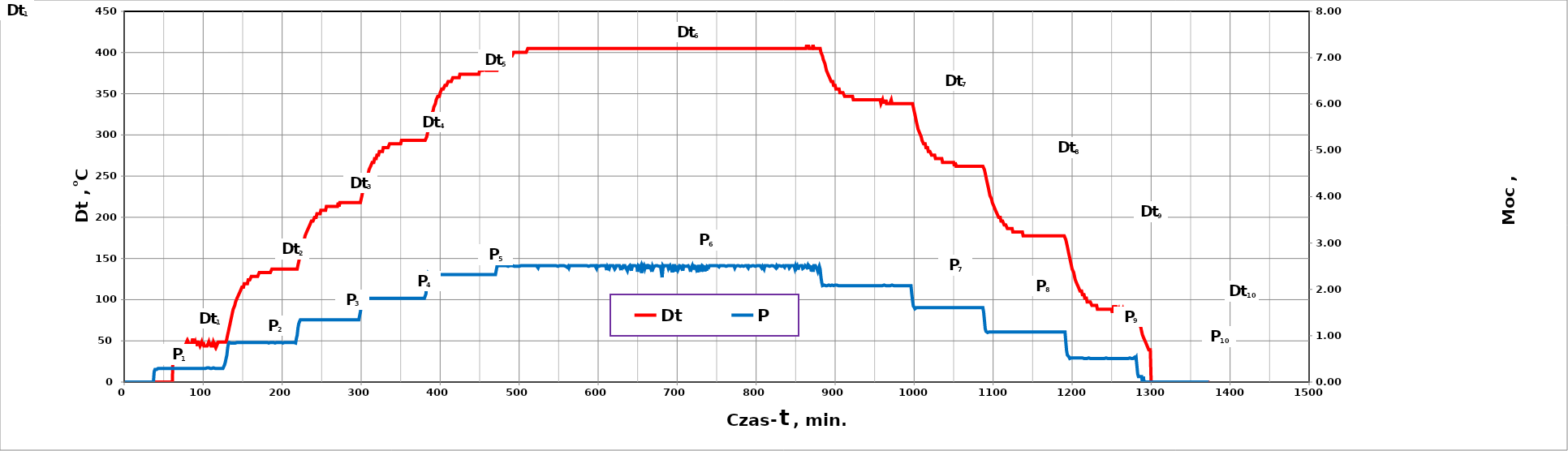
| Category | Dt |
|---|---|
| 1.0 | 0 |
| 2.0 | 0 |
| 3.0 | 0 |
| 4.0 | 0 |
| 5.0 | 0 |
| 6.0 | 0 |
| 7.0 | 0 |
| 8.0 | 0 |
| 9.0 | 0 |
| 10.0 | 0 |
| 11.0 | 0 |
| 12.0 | 0 |
| 13.0 | 0 |
| 14.0 | 0 |
| 15.0 | 0 |
| 16.0 | 0 |
| 17.0 | 0 |
| 18.0 | 0 |
| 19.0 | 0 |
| 20.0 | 0 |
| 21.0 | 0 |
| 22.0 | 0 |
| 23.0 | 0 |
| 24.0 | 0 |
| 25.0 | 0 |
| 26.0 | 0 |
| 27.0 | 0 |
| 28.0 | 0 |
| 29.0 | 0 |
| 30.0 | 0 |
| 31.0 | 0 |
| 32.0 | 0 |
| 33.0 | 0 |
| 34.0 | 0 |
| 35.0 | 0 |
| 36.0 | 0 |
| 37.0 | 0 |
| 38.0 | 0 |
| 39.0 | 0 |
| 40.0 | 0 |
| 41.0 | 0 |
| 42.0 | 0 |
| 43.0 | 0 |
| 44.0 | 0 |
| 45.0 | 0 |
| 46.0 | 0 |
| 47.0 | 0 |
| 48.0 | 0 |
| 49.0 | 0 |
| 50.0 | 0 |
| 51.0 | 0 |
| 52.0 | 0 |
| 53.0 | 0 |
| 54.0 | 0 |
| 55.0 | 0 |
| 56.0 | 0 |
| 57.0 | 0 |
| 58.0 | 0 |
| 59.0 | 0 |
| 60.0 | 0 |
| 61.0 | 0 |
| 62.0 | 39.147 |
| 63.0 | 39.147 |
| 64.0 | 39.147 |
| 65.0 | 39.147 |
| 66.0 | 39.147 |
| 67.0 | 39.147 |
| 68.0 | 39.147 |
| 69.0 | 39.147 |
| 70.0 | 39.147 |
| 71.0 | 39.147 |
| 72.0 | 39.147 |
| 73.0 | 43.798 |
| 74.0 | 43.798 |
| 75.0 | 43.798 |
| 76.0 | 43.798 |
| 77.0 | 43.798 |
| 78.0 | 43.798 |
| 79.0 | 48.45 |
| 80.0 | 43.798 |
| 81.0 | 48.45 |
| 82.0 | 48.45 |
| 83.0 | 43.798 |
| 84.0 | 48.45 |
| 85.0 | 43.798 |
| 86.0 | 43.798 |
| 87.0 | 52.713 |
| 88.0 | 43.798 |
| 89.0 | 43.798 |
| 90.0 | 48.45 |
| 91.0 | 43.798 |
| 92.0 | 48.45 |
| 93.0 | 48.45 |
| 94.0 | 48.45 |
| 95.0 | 48.45 |
| 96.0 | 43.798 |
| 97.0 | 43.798 |
| 98.0 | 48.45 |
| 99.0 | 43.798 |
| 100.0 | 48.45 |
| 101.0 | 43.798 |
| 102.0 | 43.798 |
| 103.0 | 43.798 |
| 104.0 | 43.798 |
| 105.0 | 43.798 |
| 106.0 | 43.798 |
| 107.0 | 48.45 |
| 108.0 | 43.798 |
| 109.0 | 48.45 |
| 110.0 | 43.798 |
| 111.0 | 43.798 |
| 112.0 | 43.798 |
| 113.0 | 48.45 |
| 114.0 | 48.45 |
| 115.0 | 43.798 |
| 116.0 | 48.45 |
| 117.0 | 43.798 |
| 118.0 | 43.798 |
| 119.0 | 48.45 |
| 120.0 | 48.45 |
| 121.0 | 48.45 |
| 122.0 | 48.45 |
| 123.0 | 48.45 |
| 124.0 | 48.45 |
| 125.0 | 48.45 |
| 126.0 | 48.45 |
| 127.0 | 48.45 |
| 128.0 | 48.45 |
| 129.0 | 48.45 |
| 130.0 | 52.713 |
| 131.0 | 57.364 |
| 132.0 | 61.628 |
| 133.0 | 66.279 |
| 134.0 | 70.543 |
| 135.0 | 75.194 |
| 136.0 | 79.457 |
| 137.0 | 84.109 |
| 138.0 | 88.372 |
| 139.0 | 88.372 |
| 140.0 | 93.023 |
| 141.0 | 97.287 |
| 142.0 | 97.287 |
| 143.0 | 101.938 |
| 144.0 | 101.938 |
| 145.0 | 106.202 |
| 146.0 | 106.202 |
| 147.0 | 110.465 |
| 148.0 | 110.465 |
| 149.0 | 115.116 |
| 150.0 | 115.116 |
| 151.0 | 115.116 |
| 152.0 | 119.38 |
| 153.0 | 119.38 |
| 154.0 | 119.38 |
| 155.0 | 119.38 |
| 156.0 | 119.38 |
| 157.0 | 124.031 |
| 158.0 | 124.031 |
| 159.0 | 124.031 |
| 160.0 | 124.031 |
| 161.0 | 128.295 |
| 162.0 | 128.295 |
| 163.0 | 128.295 |
| 164.0 | 128.295 |
| 165.0 | 128.295 |
| 166.0 | 128.295 |
| 167.0 | 128.295 |
| 168.0 | 128.295 |
| 169.0 | 128.295 |
| 170.0 | 128.295 |
| 171.0 | 132.946 |
| 172.0 | 132.946 |
| 173.0 | 132.946 |
| 174.0 | 132.946 |
| 175.0 | 132.946 |
| 176.0 | 132.946 |
| 177.0 | 132.946 |
| 178.0 | 132.946 |
| 179.0 | 132.946 |
| 180.0 | 132.946 |
| 181.0 | 132.946 |
| 182.0 | 132.946 |
| 183.0 | 132.946 |
| 184.0 | 132.946 |
| 185.0 | 132.946 |
| 186.0 | 132.946 |
| 187.0 | 137.209 |
| 188.0 | 137.209 |
| 189.0 | 137.209 |
| 190.0 | 137.209 |
| 191.0 | 137.209 |
| 192.0 | 137.209 |
| 193.0 | 137.209 |
| 194.0 | 137.209 |
| 195.0 | 137.209 |
| 196.0 | 137.209 |
| 197.0 | 137.209 |
| 198.0 | 137.209 |
| 199.0 | 137.209 |
| 200.0 | 137.209 |
| 201.0 | 137.209 |
| 202.0 | 137.209 |
| 203.0 | 137.209 |
| 204.0 | 137.209 |
| 205.0 | 137.209 |
| 206.0 | 137.209 |
| 207.0 | 137.209 |
| 208.0 | 137.209 |
| 209.0 | 137.209 |
| 210.0 | 137.209 |
| 211.0 | 137.209 |
| 212.0 | 137.209 |
| 213.0 | 137.209 |
| 214.0 | 137.209 |
| 215.0 | 137.209 |
| 216.0 | 137.209 |
| 217.0 | 137.209 |
| 218.0 | 137.209 |
| 219.0 | 137.209 |
| 220.0 | 141.86 |
| 221.0 | 146.124 |
| 222.0 | 150.775 |
| 223.0 | 155.039 |
| 224.0 | 159.69 |
| 225.0 | 164.341 |
| 226.0 | 168.605 |
| 227.0 | 168.605 |
| 228.0 | 172.868 |
| 229.0 | 177.519 |
| 230.0 | 177.519 |
| 231.0 | 182.171 |
| 232.0 | 182.171 |
| 233.0 | 186.434 |
| 234.0 | 186.434 |
| 235.0 | 190.698 |
| 236.0 | 190.698 |
| 237.0 | 195.349 |
| 238.0 | 195.349 |
| 239.0 | 195.349 |
| 240.0 | 195.349 |
| 241.0 | 200 |
| 242.0 | 200 |
| 243.0 | 200 |
| 244.0 | 204.264 |
| 245.0 | 204.264 |
| 246.0 | 204.264 |
| 247.0 | 204.264 |
| 248.0 | 204.264 |
| 249.0 | 208.527 |
| 250.0 | 208.527 |
| 251.0 | 208.527 |
| 252.0 | 208.527 |
| 253.0 | 208.527 |
| 254.0 | 208.527 |
| 255.0 | 208.527 |
| 256.0 | 213.178 |
| 257.0 | 213.178 |
| 258.0 | 213.178 |
| 259.0 | 213.178 |
| 260.0 | 213.178 |
| 261.0 | 213.178 |
| 262.0 | 213.178 |
| 263.0 | 213.178 |
| 264.0 | 213.178 |
| 265.0 | 213.178 |
| 266.0 | 213.178 |
| 267.0 | 213.178 |
| 268.0 | 213.178 |
| 269.0 | 213.178 |
| 270.0 | 213.178 |
| 271.0 | 217.829 |
| 272.0 | 213.178 |
| 273.0 | 217.829 |
| 274.0 | 217.829 |
| 275.0 | 217.829 |
| 276.0 | 217.829 |
| 277.0 | 217.829 |
| 278.0 | 217.829 |
| 279.0 | 217.829 |
| 280.0 | 217.829 |
| 281.0 | 217.829 |
| 282.0 | 217.829 |
| 283.0 | 217.829 |
| 284.0 | 217.829 |
| 285.0 | 217.829 |
| 286.0 | 217.829 |
| 287.0 | 217.829 |
| 288.0 | 217.829 |
| 289.0 | 217.829 |
| 290.0 | 217.829 |
| 291.0 | 217.829 |
| 292.0 | 217.829 |
| 293.0 | 217.829 |
| 294.0 | 217.829 |
| 295.0 | 217.829 |
| 296.0 | 217.829 |
| 297.0 | 217.829 |
| 298.0 | 217.829 |
| 299.0 | 217.829 |
| 300.0 | 222.093 |
| 301.0 | 226.357 |
| 302.0 | 231.008 |
| 303.0 | 235.659 |
| 304.0 | 235.659 |
| 305.0 | 239.922 |
| 306.0 | 244.186 |
| 307.0 | 248.837 |
| 308.0 | 248.837 |
| 309.0 | 253.488 |
| 310.0 | 257.752 |
| 311.0 | 257.752 |
| 312.0 | 262.016 |
| 313.0 | 262.016 |
| 314.0 | 266.667 |
| 315.0 | 266.667 |
| 316.0 | 266.667 |
| 317.0 | 271.318 |
| 318.0 | 271.318 |
| 319.0 | 271.318 |
| 320.0 | 275.581 |
| 321.0 | 275.581 |
| 322.0 | 275.581 |
| 323.0 | 279.845 |
| 324.0 | 279.845 |
| 325.0 | 279.845 |
| 326.0 | 279.845 |
| 327.0 | 279.845 |
| 328.0 | 284.496 |
| 329.0 | 284.496 |
| 330.0 | 284.496 |
| 331.0 | 284.496 |
| 332.0 | 284.496 |
| 333.0 | 284.496 |
| 334.0 | 284.496 |
| 335.0 | 284.496 |
| 336.0 | 289.147 |
| 337.0 | 289.147 |
| 338.0 | 289.147 |
| 339.0 | 289.147 |
| 340.0 | 289.147 |
| 341.0 | 289.147 |
| 342.0 | 289.147 |
| 343.0 | 289.147 |
| 344.0 | 289.147 |
| 345.0 | 289.147 |
| 346.0 | 289.147 |
| 347.0 | 289.147 |
| 348.0 | 289.147 |
| 349.0 | 289.147 |
| 350.0 | 289.147 |
| 351.0 | 293.411 |
| 352.0 | 293.411 |
| 353.0 | 293.411 |
| 354.0 | 293.411 |
| 355.0 | 293.411 |
| 356.0 | 293.411 |
| 357.0 | 293.411 |
| 358.0 | 293.411 |
| 359.0 | 293.411 |
| 360.0 | 293.411 |
| 361.0 | 293.411 |
| 362.0 | 293.411 |
| 363.0 | 293.411 |
| 364.0 | 293.411 |
| 365.0 | 293.411 |
| 366.0 | 293.411 |
| 367.0 | 293.411 |
| 368.0 | 293.411 |
| 369.0 | 293.411 |
| 370.0 | 293.411 |
| 371.0 | 293.411 |
| 372.0 | 293.411 |
| 373.0 | 293.411 |
| 374.0 | 293.411 |
| 375.0 | 293.411 |
| 376.0 | 293.411 |
| 377.0 | 293.411 |
| 378.0 | 293.411 |
| 379.0 | 293.411 |
| 380.0 | 293.411 |
| 381.0 | 293.411 |
| 382.0 | 293.411 |
| 383.0 | 297.674 |
| 384.0 | 302.326 |
| 385.0 | 306.977 |
| 386.0 | 311.24 |
| 387.0 | 315.504 |
| 388.0 | 320.155 |
| 389.0 | 324.806 |
| 390.0 | 324.806 |
| 391.0 | 329.07 |
| 392.0 | 333.721 |
| 393.0 | 333.721 |
| 394.0 | 337.984 |
| 395.0 | 342.636 |
| 396.0 | 342.636 |
| 397.0 | 346.899 |
| 398.0 | 346.899 |
| 399.0 | 346.899 |
| 400.0 | 351.163 |
| 401.0 | 351.163 |
| 402.0 | 355.814 |
| 403.0 | 355.814 |
| 404.0 | 355.814 |
| 405.0 | 355.814 |
| 406.0 | 360.078 |
| 407.0 | 360.078 |
| 408.0 | 360.078 |
| 409.0 | 360.078 |
| 410.0 | 364.729 |
| 411.0 | 364.729 |
| 412.0 | 364.729 |
| 413.0 | 364.729 |
| 414.0 | 364.729 |
| 415.0 | 364.729 |
| 416.0 | 369.38 |
| 417.0 | 369.38 |
| 418.0 | 369.38 |
| 419.0 | 369.38 |
| 420.0 | 369.38 |
| 421.0 | 369.38 |
| 422.0 | 369.38 |
| 423.0 | 369.38 |
| 424.0 | 369.38 |
| 425.0 | 373.643 |
| 426.0 | 373.643 |
| 427.0 | 373.643 |
| 428.0 | 373.643 |
| 429.0 | 373.643 |
| 430.0 | 373.643 |
| 431.0 | 373.643 |
| 432.0 | 373.643 |
| 433.0 | 373.643 |
| 434.0 | 373.643 |
| 435.0 | 373.643 |
| 436.0 | 373.643 |
| 437.0 | 373.643 |
| 438.0 | 373.643 |
| 439.0 | 373.643 |
| 440.0 | 373.643 |
| 441.0 | 373.643 |
| 442.0 | 373.643 |
| 443.0 | 373.643 |
| 444.0 | 373.643 |
| 445.0 | 373.643 |
| 446.0 | 373.643 |
| 447.0 | 373.643 |
| 448.0 | 373.643 |
| 449.0 | 373.643 |
| 450.0 | 378.295 |
| 451.0 | 378.295 |
| 452.0 | 378.295 |
| 453.0 | 378.295 |
| 454.0 | 378.295 |
| 455.0 | 378.295 |
| 456.0 | 382.558 |
| 457.0 | 382.558 |
| 458.0 | 378.295 |
| 459.0 | 378.295 |
| 460.0 | 378.295 |
| 461.0 | 378.295 |
| 462.0 | 378.295 |
| 463.0 | 378.295 |
| 464.0 | 378.295 |
| 465.0 | 378.295 |
| 466.0 | 378.295 |
| 467.0 | 378.295 |
| 468.0 | 378.295 |
| 469.0 | 378.295 |
| 470.0 | 378.295 |
| 471.0 | 378.295 |
| 472.0 | 378.295 |
| 473.0 | 382.558 |
| 474.0 | 382.558 |
| 475.0 | 382.558 |
| 476.0 | 386.822 |
| 477.0 | 386.822 |
| 478.0 | 386.822 |
| 479.0 | 386.822 |
| 480.0 | 391.473 |
| 481.0 | 391.473 |
| 482.0 | 391.473 |
| 483.0 | 391.473 |
| 484.0 | 391.473 |
| 485.0 | 395.736 |
| 486.0 | 395.736 |
| 487.0 | 395.736 |
| 488.0 | 395.736 |
| 489.0 | 395.736 |
| 490.0 | 395.736 |
| 491.0 | 395.736 |
| 492.0 | 395.736 |
| 493.0 | 400.388 |
| 494.0 | 400.388 |
| 495.0 | 400.388 |
| 496.0 | 400.388 |
| 497.0 | 400.388 |
| 498.0 | 400.388 |
| 499.0 | 400.388 |
| 500.0 | 400.388 |
| 501.0 | 400.388 |
| 502.0 | 400.388 |
| 503.0 | 400.388 |
| 504.0 | 400.388 |
| 505.0 | 400.388 |
| 506.0 | 400.388 |
| 507.0 | 400.388 |
| 508.0 | 400.388 |
| 509.0 | 400.388 |
| 510.0 | 400.388 |
| 511.0 | 405.039 |
| 512.0 | 405.039 |
| 513.0 | 405.039 |
| 514.0 | 405.039 |
| 515.0 | 405.039 |
| 516.0 | 405.039 |
| 517.0 | 405.039 |
| 518.0 | 405.039 |
| 519.0 | 405.039 |
| 520.0 | 405.039 |
| 521.0 | 405.039 |
| 522.0 | 405.039 |
| 523.0 | 405.039 |
| 524.0 | 405.039 |
| 525.0 | 405.039 |
| 526.0 | 405.039 |
| 527.0 | 405.039 |
| 528.0 | 405.039 |
| 529.0 | 405.039 |
| 530.0 | 405.039 |
| 531.0 | 405.039 |
| 532.0 | 405.039 |
| 533.0 | 405.039 |
| 534.0 | 405.039 |
| 535.0 | 405.039 |
| 536.0 | 405.039 |
| 537.0 | 405.039 |
| 538.0 | 405.039 |
| 539.0 | 405.039 |
| 540.0 | 405.039 |
| 541.0 | 405.039 |
| 542.0 | 405.039 |
| 543.0 | 405.039 |
| 544.0 | 405.039 |
| 545.0 | 405.039 |
| 546.0 | 405.039 |
| 547.0 | 405.039 |
| 548.0 | 405.039 |
| 549.0 | 405.039 |
| 550.0 | 405.039 |
| 551.0 | 405.039 |
| 552.0 | 405.039 |
| 553.0 | 405.039 |
| 554.0 | 405.039 |
| 555.0 | 405.039 |
| 556.0 | 405.039 |
| 557.0 | 405.039 |
| 558.0 | 405.039 |
| 559.0 | 405.039 |
| 560.0 | 405.039 |
| 561.0 | 405.039 |
| 562.0 | 405.039 |
| 563.0 | 405.039 |
| 564.0 | 405.039 |
| 565.0 | 405.039 |
| 566.0 | 405.039 |
| 567.0 | 405.039 |
| 568.0 | 405.039 |
| 569.0 | 405.039 |
| 570.0 | 405.039 |
| 571.0 | 405.039 |
| 572.0 | 405.039 |
| 573.0 | 405.039 |
| 574.0 | 405.039 |
| 575.0 | 405.039 |
| 576.0 | 405.039 |
| 577.0 | 405.039 |
| 578.0 | 405.039 |
| 579.0 | 405.039 |
| 580.0 | 405.039 |
| 581.0 | 405.039 |
| 582.0 | 405.039 |
| 583.0 | 405.039 |
| 584.0 | 405.039 |
| 585.0 | 405.039 |
| 586.0 | 405.039 |
| 587.0 | 405.039 |
| 588.0 | 405.039 |
| 589.0 | 405.039 |
| 590.0 | 405.039 |
| 591.0 | 405.039 |
| 592.0 | 405.039 |
| 593.0 | 405.039 |
| 594.0 | 405.039 |
| 595.0 | 405.039 |
| 596.0 | 405.039 |
| 597.0 | 405.039 |
| 598.0 | 405.039 |
| 599.0 | 405.039 |
| 600.0 | 405.039 |
| 601.0 | 405.039 |
| 602.0 | 405.039 |
| 603.0 | 405.039 |
| 604.0 | 405.039 |
| 605.0 | 405.039 |
| 606.0 | 405.039 |
| 607.0 | 405.039 |
| 608.0 | 405.039 |
| 609.0 | 405.039 |
| 610.0 | 405.039 |
| 611.0 | 405.039 |
| 612.0 | 405.039 |
| 613.0 | 405.039 |
| 614.0 | 405.039 |
| 615.0 | 405.039 |
| 616.0 | 405.039 |
| 617.0 | 405.039 |
| 618.0 | 405.039 |
| 619.0 | 405.039 |
| 620.0 | 405.039 |
| 621.0 | 405.039 |
| 622.0 | 405.039 |
| 623.0 | 405.039 |
| 624.0 | 405.039 |
| 625.0 | 405.039 |
| 626.0 | 405.039 |
| 627.0 | 405.039 |
| 628.0 | 405.039 |
| 629.0 | 405.039 |
| 630.0 | 405.039 |
| 631.0 | 405.039 |
| 632.0 | 405.039 |
| 633.0 | 405.039 |
| 634.0 | 405.039 |
| 635.0 | 405.039 |
| 636.0 | 405.039 |
| 637.0 | 405.039 |
| 638.0 | 405.039 |
| 639.0 | 405.039 |
| 640.0 | 405.039 |
| 641.0 | 405.039 |
| 642.0 | 405.039 |
| 643.0 | 405.039 |
| 644.0 | 405.039 |
| 645.0 | 405.039 |
| 646.0 | 405.039 |
| 647.0 | 405.039 |
| 648.0 | 405.039 |
| 649.0 | 405.039 |
| 650.0 | 405.039 |
| 651.0 | 405.039 |
| 652.0 | 405.039 |
| 653.0 | 405.039 |
| 654.0 | 405.039 |
| 655.0 | 405.039 |
| 656.0 | 405.039 |
| 657.0 | 405.039 |
| 658.0 | 405.039 |
| 659.0 | 405.039 |
| 660.0 | 405.039 |
| 661.0 | 405.039 |
| 662.0 | 405.039 |
| 663.0 | 405.039 |
| 664.0 | 405.039 |
| 665.0 | 405.039 |
| 666.0 | 405.039 |
| 667.0 | 405.039 |
| 668.0 | 405.039 |
| 669.0 | 405.039 |
| 670.0 | 405.039 |
| 671.0 | 405.039 |
| 672.0 | 405.039 |
| 673.0 | 405.039 |
| 674.0 | 405.039 |
| 675.0 | 405.039 |
| 676.0 | 405.039 |
| 677.0 | 405.039 |
| 678.0 | 405.039 |
| 679.0 | 405.039 |
| 680.0 | 405.039 |
| 681.0 | 405.039 |
| 682.0 | 405.039 |
| 683.0 | 405.039 |
| 684.0 | 405.039 |
| 685.0 | 405.039 |
| 686.0 | 405.039 |
| 687.0 | 405.039 |
| 688.0 | 405.039 |
| 689.0 | 405.039 |
| 690.0 | 405.039 |
| 691.0 | 405.039 |
| 692.0 | 405.039 |
| 693.0 | 405.039 |
| 694.0 | 405.039 |
| 695.0 | 405.039 |
| 696.0 | 405.039 |
| 697.0 | 405.039 |
| 698.0 | 405.039 |
| 699.0 | 405.039 |
| 700.0 | 405.039 |
| 701.0 | 405.039 |
| 702.0 | 405.039 |
| 703.0 | 405.039 |
| 704.0 | 405.039 |
| 705.0 | 405.039 |
| 706.0 | 405.039 |
| 707.0 | 405.039 |
| 708.0 | 405.039 |
| 709.0 | 405.039 |
| 710.0 | 405.039 |
| 711.0 | 405.039 |
| 712.0 | 405.039 |
| 713.0 | 405.039 |
| 714.0 | 405.039 |
| 715.0 | 405.039 |
| 716.0 | 405.039 |
| 717.0 | 405.039 |
| 718.0 | 405.039 |
| 719.0 | 405.039 |
| 720.0 | 405.039 |
| 721.0 | 405.039 |
| 722.0 | 405.039 |
| 723.0 | 405.039 |
| 724.0 | 405.039 |
| 725.0 | 405.039 |
| 726.0 | 405.039 |
| 727.0 | 405.039 |
| 728.0 | 405.039 |
| 729.0 | 405.039 |
| 730.0 | 405.039 |
| 731.0 | 405.039 |
| 732.0 | 405.039 |
| 733.0 | 405.039 |
| 734.0 | 405.039 |
| 735.0 | 405.039 |
| 736.0 | 405.039 |
| 737.0 | 405.039 |
| 738.0 | 405.039 |
| 739.0 | 405.039 |
| 740.0 | 405.039 |
| 741.0 | 405.039 |
| 742.0 | 405.039 |
| 743.0 | 405.039 |
| 744.0 | 405.039 |
| 745.0 | 405.039 |
| 746.0 | 405.039 |
| 747.0 | 405.039 |
| 748.0 | 405.039 |
| 749.0 | 405.039 |
| 750.0 | 405.039 |
| 751.0 | 405.039 |
| 752.0 | 405.039 |
| 753.0 | 405.039 |
| 754.0 | 405.039 |
| 755.0 | 405.039 |
| 756.0 | 405.039 |
| 757.0 | 405.039 |
| 758.0 | 405.039 |
| 759.0 | 405.039 |
| 760.0 | 405.039 |
| 761.0 | 405.039 |
| 762.0 | 405.039 |
| 763.0 | 405.039 |
| 764.0 | 405.039 |
| 765.0 | 405.039 |
| 766.0 | 405.039 |
| 767.0 | 405.039 |
| 768.0 | 405.039 |
| 769.0 | 405.039 |
| 770.0 | 405.039 |
| 771.0 | 405.039 |
| 772.0 | 405.039 |
| 773.0 | 405.039 |
| 774.0 | 405.039 |
| 775.0 | 405.039 |
| 776.0 | 405.039 |
| 777.0 | 405.039 |
| 778.0 | 405.039 |
| 779.0 | 405.039 |
| 780.0 | 405.039 |
| 781.0 | 405.039 |
| 782.0 | 405.039 |
| 783.0 | 405.039 |
| 784.0 | 405.039 |
| 785.0 | 405.039 |
| 786.0 | 405.039 |
| 787.0 | 405.039 |
| 788.0 | 405.039 |
| 789.0 | 405.039 |
| 790.0 | 405.039 |
| 791.0 | 405.039 |
| 792.0 | 405.039 |
| 793.0 | 405.039 |
| 794.0 | 405.039 |
| 795.0 | 405.039 |
| 796.0 | 405.039 |
| 797.0 | 405.039 |
| 798.0 | 405.039 |
| 799.0 | 405.039 |
| 800.0 | 405.039 |
| 801.0 | 405.039 |
| 802.0 | 405.039 |
| 803.0 | 405.039 |
| 804.0 | 405.039 |
| 805.0 | 405.039 |
| 806.0 | 405.039 |
| 807.0 | 405.039 |
| 808.0 | 405.039 |
| 809.0 | 405.039 |
| 810.0 | 405.039 |
| 811.0 | 405.039 |
| 812.0 | 405.039 |
| 813.0 | 405.039 |
| 814.0 | 405.039 |
| 815.0 | 405.039 |
| 816.0 | 405.039 |
| 817.0 | 405.039 |
| 818.0 | 405.039 |
| 819.0 | 405.039 |
| 820.0 | 405.039 |
| 821.0 | 405.039 |
| 822.0 | 405.039 |
| 823.0 | 405.039 |
| 824.0 | 405.039 |
| 825.0 | 405.039 |
| 826.0 | 405.039 |
| 827.0 | 405.039 |
| 828.0 | 405.039 |
| 829.0 | 405.039 |
| 830.0 | 405.039 |
| 831.0 | 405.039 |
| 832.0 | 405.039 |
| 833.0 | 405.039 |
| 834.0 | 405.039 |
| 835.0 | 405.039 |
| 836.0 | 405.039 |
| 837.0 | 405.039 |
| 838.0 | 405.039 |
| 839.0 | 405.039 |
| 840.0 | 405.039 |
| 841.0 | 405.039 |
| 842.0 | 405.039 |
| 843.0 | 405.039 |
| 844.0 | 405.039 |
| 845.0 | 405.039 |
| 846.0 | 405.039 |
| 847.0 | 405.039 |
| 848.0 | 405.039 |
| 849.0 | 405.039 |
| 850.0 | 405.039 |
| 851.0 | 405.039 |
| 852.0 | 405.039 |
| 853.0 | 405.039 |
| 854.0 | 405.039 |
| 855.0 | 405.039 |
| 856.0 | 405.039 |
| 857.0 | 405.039 |
| 858.0 | 405.039 |
| 859.0 | 405.039 |
| 860.0 | 405.039 |
| 861.0 | 405.039 |
| 862.0 | 405.039 |
| 863.0 | 405.039 |
| 864.0 | 409.302 |
| 865.0 | 405.039 |
| 866.0 | 409.302 |
| 867.0 | 405.039 |
| 868.0 | 405.039 |
| 869.0 | 405.039 |
| 870.0 | 405.039 |
| 871.0 | 405.039 |
| 872.0 | 409.302 |
| 873.0 | 405.039 |
| 874.0 | 405.039 |
| 875.0 | 405.039 |
| 876.0 | 405.039 |
| 877.0 | 405.039 |
| 878.0 | 405.039 |
| 879.0 | 405.039 |
| 880.0 | 405.039 |
| 881.0 | 405.039 |
| 882.0 | 400.388 |
| 883.0 | 400.388 |
| 884.0 | 395.736 |
| 885.0 | 391.473 |
| 886.0 | 391.473 |
| 887.0 | 386.822 |
| 888.0 | 382.558 |
| 889.0 | 378.295 |
| 890.0 | 378.295 |
| 891.0 | 373.643 |
| 892.0 | 373.643 |
| 893.0 | 369.38 |
| 894.0 | 369.38 |
| 895.0 | 364.729 |
| 896.0 | 364.729 |
| 897.0 | 364.729 |
| 898.0 | 360.078 |
| 899.0 | 360.078 |
| 900.0 | 360.078 |
| 901.0 | 355.814 |
| 902.0 | 355.814 |
| 903.0 | 355.814 |
| 904.0 | 355.814 |
| 905.0 | 355.814 |
| 906.0 | 351.163 |
| 907.0 | 351.163 |
| 908.0 | 351.163 |
| 909.0 | 351.163 |
| 910.0 | 351.163 |
| 911.0 | 351.163 |
| 912.0 | 346.899 |
| 913.0 | 346.899 |
| 914.0 | 346.899 |
| 915.0 | 346.899 |
| 916.0 | 346.899 |
| 917.0 | 346.899 |
| 918.0 | 346.899 |
| 919.0 | 346.899 |
| 920.0 | 346.899 |
| 921.0 | 346.899 |
| 922.0 | 346.899 |
| 923.0 | 342.636 |
| 924.0 | 342.636 |
| 925.0 | 342.636 |
| 926.0 | 342.636 |
| 927.0 | 342.636 |
| 928.0 | 342.636 |
| 929.0 | 342.636 |
| 930.0 | 342.636 |
| 931.0 | 342.636 |
| 932.0 | 342.636 |
| 933.0 | 342.636 |
| 934.0 | 342.636 |
| 935.0 | 342.636 |
| 936.0 | 342.636 |
| 937.0 | 342.636 |
| 938.0 | 342.636 |
| 939.0 | 342.636 |
| 940.0 | 342.636 |
| 941.0 | 342.636 |
| 942.0 | 342.636 |
| 943.0 | 342.636 |
| 944.0 | 342.636 |
| 945.0 | 342.636 |
| 946.0 | 342.636 |
| 947.0 | 342.636 |
| 948.0 | 342.636 |
| 949.0 | 342.636 |
| 950.0 | 342.636 |
| 951.0 | 342.636 |
| 952.0 | 342.636 |
| 953.0 | 342.636 |
| 954.0 | 342.636 |
| 955.0 | 342.636 |
| 956.0 | 342.636 |
| 957.0 | 342.636 |
| 958.0 | 337.984 |
| 959.0 | 337.984 |
| 960.0 | 342.636 |
| 961.0 | 337.984 |
| 962.0 | 342.636 |
| 963.0 | 337.984 |
| 964.0 | 342.636 |
| 965.0 | 337.984 |
| 966.0 | 337.984 |
| 967.0 | 337.984 |
| 968.0 | 337.984 |
| 969.0 | 337.984 |
| 970.0 | 337.984 |
| 971.0 | 342.636 |
| 972.0 | 337.984 |
| 973.0 | 337.984 |
| 974.0 | 337.984 |
| 975.0 | 337.984 |
| 976.0 | 337.984 |
| 977.0 | 337.984 |
| 978.0 | 337.984 |
| 979.0 | 337.984 |
| 980.0 | 337.984 |
| 981.0 | 337.984 |
| 982.0 | 337.984 |
| 983.0 | 337.984 |
| 984.0 | 337.984 |
| 985.0 | 337.984 |
| 986.0 | 337.984 |
| 987.0 | 337.984 |
| 988.0 | 337.984 |
| 989.0 | 337.984 |
| 990.0 | 337.984 |
| 991.0 | 337.984 |
| 992.0 | 337.984 |
| 993.0 | 337.984 |
| 994.0 | 337.984 |
| 995.0 | 337.984 |
| 996.0 | 337.984 |
| 997.0 | 337.984 |
| 998.0 | 337.984 |
| 999.0 | 333.721 |
| 1000.0 | 329.07 |
| 1001.0 | 324.806 |
| 1002.0 | 320.155 |
| 1003.0 | 315.504 |
| 1004.0 | 311.24 |
| 1005.0 | 306.977 |
| 1006.0 | 306.977 |
| 1007.0 | 302.326 |
| 1008.0 | 302.326 |
| 1009.0 | 297.674 |
| 1010.0 | 293.411 |
| 1011.0 | 293.411 |
| 1012.0 | 289.147 |
| 1013.0 | 289.147 |
| 1014.0 | 289.147 |
| 1015.0 | 284.496 |
| 1016.0 | 284.496 |
| 1017.0 | 284.496 |
| 1018.0 | 279.845 |
| 1019.0 | 279.845 |
| 1020.0 | 279.845 |
| 1021.0 | 279.845 |
| 1022.0 | 275.581 |
| 1023.0 | 275.581 |
| 1024.0 | 275.581 |
| 1025.0 | 275.581 |
| 1026.0 | 275.581 |
| 1027.0 | 271.318 |
| 1028.0 | 271.318 |
| 1029.0 | 271.318 |
| 1030.0 | 271.318 |
| 1031.0 | 271.318 |
| 1032.0 | 271.318 |
| 1033.0 | 271.318 |
| 1034.0 | 271.318 |
| 1035.0 | 271.318 |
| 1036.0 | 266.667 |
| 1037.0 | 266.667 |
| 1038.0 | 266.667 |
| 1039.0 | 266.667 |
| 1040.0 | 266.667 |
| 1041.0 | 266.667 |
| 1042.0 | 266.667 |
| 1043.0 | 266.667 |
| 1044.0 | 266.667 |
| 1045.0 | 266.667 |
| 1046.0 | 266.667 |
| 1047.0 | 266.667 |
| 1048.0 | 266.667 |
| 1049.0 | 266.667 |
| 1050.0 | 266.667 |
| 1051.0 | 262.016 |
| 1052.0 | 266.667 |
| 1053.0 | 262.016 |
| 1054.0 | 262.016 |
| 1055.0 | 262.016 |
| 1056.0 | 262.016 |
| 1057.0 | 262.016 |
| 1058.0 | 262.016 |
| 1059.0 | 262.016 |
| 1060.0 | 262.016 |
| 1061.0 | 262.016 |
| 1062.0 | 262.016 |
| 1063.0 | 262.016 |
| 1064.0 | 262.016 |
| 1065.0 | 262.016 |
| 1066.0 | 262.016 |
| 1067.0 | 262.016 |
| 1068.0 | 262.016 |
| 1069.0 | 262.016 |
| 1070.0 | 262.016 |
| 1071.0 | 262.016 |
| 1072.0 | 262.016 |
| 1073.0 | 262.016 |
| 1074.0 | 262.016 |
| 1075.0 | 262.016 |
| 1076.0 | 262.016 |
| 1077.0 | 262.016 |
| 1078.0 | 262.016 |
| 1079.0 | 262.016 |
| 1080.0 | 262.016 |
| 1081.0 | 262.016 |
| 1082.0 | 262.016 |
| 1083.0 | 262.016 |
| 1084.0 | 262.016 |
| 1085.0 | 262.016 |
| 1086.0 | 262.016 |
| 1087.0 | 262.016 |
| 1088.0 | 262.016 |
| 1089.0 | 257.752 |
| 1090.0 | 253.488 |
| 1091.0 | 248.837 |
| 1092.0 | 244.186 |
| 1093.0 | 239.922 |
| 1094.0 | 235.659 |
| 1095.0 | 231.008 |
| 1096.0 | 226.357 |
| 1097.0 | 226.357 |
| 1098.0 | 222.093 |
| 1099.0 | 217.829 |
| 1100.0 | 217.829 |
| 1101.0 | 213.178 |
| 1102.0 | 213.178 |
| 1103.0 | 208.527 |
| 1104.0 | 208.527 |
| 1105.0 | 204.264 |
| 1106.0 | 204.264 |
| 1107.0 | 200 |
| 1108.0 | 200 |
| 1109.0 | 200 |
| 1110.0 | 195.349 |
| 1111.0 | 195.349 |
| 1112.0 | 195.349 |
| 1113.0 | 195.349 |
| 1114.0 | 190.698 |
| 1115.0 | 190.698 |
| 1116.0 | 190.698 |
| 1117.0 | 190.698 |
| 1118.0 | 186.434 |
| 1119.0 | 186.434 |
| 1120.0 | 186.434 |
| 1121.0 | 186.434 |
| 1122.0 | 186.434 |
| 1123.0 | 186.434 |
| 1124.0 | 186.434 |
| 1125.0 | 182.171 |
| 1126.0 | 182.171 |
| 1127.0 | 182.171 |
| 1128.0 | 182.171 |
| 1129.0 | 182.171 |
| 1130.0 | 182.171 |
| 1131.0 | 182.171 |
| 1132.0 | 182.171 |
| 1133.0 | 182.171 |
| 1134.0 | 182.171 |
| 1135.0 | 182.171 |
| 1136.0 | 182.171 |
| 1137.0 | 182.171 |
| 1138.0 | 177.519 |
| 1139.0 | 177.519 |
| 1140.0 | 177.519 |
| 1141.0 | 177.519 |
| 1142.0 | 177.519 |
| 1143.0 | 177.519 |
| 1144.0 | 177.519 |
| 1145.0 | 177.519 |
| 1146.0 | 177.519 |
| 1147.0 | 177.519 |
| 1148.0 | 177.519 |
| 1149.0 | 177.519 |
| 1150.0 | 177.519 |
| 1151.0 | 177.519 |
| 1152.0 | 177.519 |
| 1153.0 | 177.519 |
| 1154.0 | 177.519 |
| 1155.0 | 177.519 |
| 1156.0 | 177.519 |
| 1157.0 | 177.519 |
| 1158.0 | 177.519 |
| 1159.0 | 177.519 |
| 1160.0 | 177.519 |
| 1161.0 | 177.519 |
| 1162.0 | 177.519 |
| 1163.0 | 177.519 |
| 1164.0 | 177.519 |
| 1165.0 | 177.519 |
| 1166.0 | 177.519 |
| 1167.0 | 177.519 |
| 1168.0 | 177.519 |
| 1169.0 | 177.519 |
| 1170.0 | 177.519 |
| 1171.0 | 177.519 |
| 1172.0 | 177.519 |
| 1173.0 | 177.519 |
| 1174.0 | 177.519 |
| 1175.0 | 177.519 |
| 1176.0 | 177.519 |
| 1177.0 | 177.519 |
| 1178.0 | 177.519 |
| 1179.0 | 177.519 |
| 1180.0 | 177.519 |
| 1181.0 | 177.519 |
| 1182.0 | 177.519 |
| 1183.0 | 177.519 |
| 1184.0 | 177.519 |
| 1185.0 | 177.519 |
| 1186.0 | 177.519 |
| 1187.0 | 177.519 |
| 1188.0 | 177.519 |
| 1189.0 | 177.519 |
| 1190.0 | 177.519 |
| 1191.0 | 177.519 |
| 1192.0 | 172.868 |
| 1193.0 | 172.868 |
| 1194.0 | 164.341 |
| 1195.0 | 159.69 |
| 1196.0 | 155.039 |
| 1197.0 | 150.775 |
| 1198.0 | 146.124 |
| 1199.0 | 141.86 |
| 1200.0 | 137.209 |
| 1201.0 | 137.209 |
| 1202.0 | 132.946 |
| 1203.0 | 128.295 |
| 1204.0 | 124.031 |
| 1205.0 | 124.031 |
| 1206.0 | 119.38 |
| 1207.0 | 119.38 |
| 1208.0 | 115.116 |
| 1209.0 | 115.116 |
| 1210.0 | 110.465 |
| 1211.0 | 110.465 |
| 1212.0 | 110.465 |
| 1213.0 | 106.202 |
| 1214.0 | 106.202 |
| 1215.0 | 106.202 |
| 1216.0 | 101.938 |
| 1217.0 | 101.938 |
| 1218.0 | 101.938 |
| 1219.0 | 97.287 |
| 1220.0 | 97.287 |
| 1221.0 | 97.287 |
| 1222.0 | 97.287 |
| 1223.0 | 97.287 |
| 1224.0 | 97.287 |
| 1225.0 | 93.023 |
| 1226.0 | 93.023 |
| 1227.0 | 93.023 |
| 1228.0 | 93.023 |
| 1229.0 | 93.023 |
| 1230.0 | 93.023 |
| 1231.0 | 93.023 |
| 1232.0 | 88.372 |
| 1233.0 | 88.372 |
| 1234.0 | 88.372 |
| 1235.0 | 88.372 |
| 1236.0 | 88.372 |
| 1237.0 | 88.372 |
| 1238.0 | 88.372 |
| 1239.0 | 88.372 |
| 1240.0 | 88.372 |
| 1241.0 | 88.372 |
| 1242.0 | 88.372 |
| 1243.0 | 88.372 |
| 1244.0 | 88.372 |
| 1245.0 | 88.372 |
| 1246.0 | 88.372 |
| 1247.0 | 88.372 |
| 1248.0 | 88.372 |
| 1249.0 | 88.372 |
| 1250.0 | 88.372 |
| 1251.0 | 84.109 |
| 1252.0 | 84.109 |
| 1253.0 | 93.023 |
| 1254.0 | 84.109 |
| 1255.0 | 93.023 |
| 1256.0 | 93.023 |
| 1257.0 | 84.109 |
| 1258.0 | 84.109 |
| 1259.0 | 88.372 |
| 1260.0 | 84.109 |
| 1261.0 | 88.372 |
| 1262.0 | 84.109 |
| 1263.0 | 84.109 |
| 1264.0 | 88.372 |
| 1265.0 | 84.109 |
| 1266.0 | 84.109 |
| 1267.0 | 84.109 |
| 1268.0 | 84.109 |
| 1269.0 | 84.109 |
| 1270.0 | 84.109 |
| 1271.0 | 84.109 |
| 1272.0 | 84.109 |
| 1273.0 | 84.109 |
| 1274.0 | 84.109 |
| 1275.0 | 84.109 |
| 1276.0 | 84.109 |
| 1277.0 | 84.109 |
| 1278.0 | 84.109 |
| 1279.0 | 84.109 |
| 1280.0 | 84.109 |
| 1281.0 | 84.109 |
| 1282.0 | 84.109 |
| 1283.0 | 79.457 |
| 1284.0 | 75.194 |
| 1285.0 | 70.543 |
| 1286.0 | 70.543 |
| 1287.0 | 66.279 |
| 1288.0 | 61.628 |
| 1289.0 | 57.364 |
| 1290.0 | 57.364 |
| 1291.0 | 52.713 |
| 1292.0 | 52.713 |
| 1293.0 | 48.45 |
| 1294.0 | 48.45 |
| 1295.0 | 43.798 |
| 1296.0 | 43.798 |
| 1297.0 | 39.147 |
| 1298.0 | 39.147 |
| 1299.0 | 39.147 |
| 1300.0 | 0 |
| 1301.0 | 0 |
| 1302.0 | 0 |
| 1303.0 | 0 |
| 1304.0 | 0 |
| 1305.0 | 0 |
| 1306.0 | 0 |
| 1307.0 | 0 |
| 1308.0 | 0 |
| 1309.0 | 0 |
| 1310.0 | 0 |
| 1311.0 | 0 |
| 1312.0 | 0 |
| 1313.0 | 0 |
| 1314.0 | 0 |
| 1315.0 | 0 |
| 1316.0 | 0 |
| 1317.0 | 0 |
| 1318.0 | 0 |
| 1319.0 | 0 |
| 1320.0 | 0 |
| 1321.0 | 0 |
| 1322.0 | 0 |
| 1323.0 | 0 |
| 1324.0 | 0 |
| 1325.0 | 0 |
| 1326.0 | 0 |
| 1327.0 | 0 |
| 1328.0 | 0 |
| 1329.0 | 0 |
| 1330.0 | 0 |
| 1331.0 | 0 |
| 1332.0 | 0 |
| 1333.0 | 0 |
| 1334.0 | 0 |
| 1335.0 | 0 |
| 1336.0 | 0 |
| 1337.0 | 0 |
| 1338.0 | 0 |
| 1339.0 | 0 |
| 1340.0 | 0 |
| 1341.0 | 0 |
| 1342.0 | 0 |
| 1343.0 | 0 |
| 1344.0 | 0 |
| 1345.0 | 0 |
| 1346.0 | 0 |
| 1347.0 | 0 |
| 1348.0 | 0 |
| 1349.0 | 0 |
| 1350.0 | 0 |
| 1351.0 | 0 |
| 1352.0 | 0 |
| 1353.0 | 0 |
| 1354.0 | 0 |
| 1355.0 | 0 |
| 1356.0 | 0 |
| 1357.0 | 0 |
| 1358.0 | 0 |
| 1359.0 | 0 |
| 1360.0 | 0 |
| 1361.0 | 0 |
| 1362.0 | 0 |
| 1363.0 | 0 |
| 1364.0 | 0 |
| 1365.0 | 0 |
| 1366.0 | 0 |
| 1367.0 | 0 |
| 1368.0 | 0 |
| 1369.0 | 0 |
| 1370.0 | 0 |
| 1371.0 | 0 |
| 1372.0 | 0 |
| 1373.0 | 0 |
| 1374.0 | 0 |